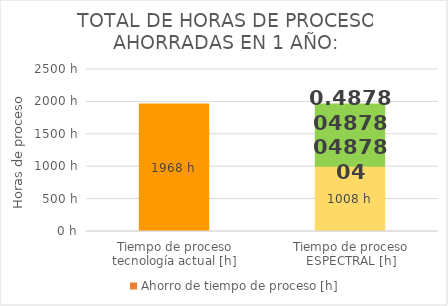
| Category | Tiempo de proceso tecnología actual [h] | Ahorro de tiempo de proceso [h] |
|---|---|---|
| Tiempo de proceso tecnología actual [h] | 1968 | 0 |
| Tiempo de proceso ESPECTRAL [h] | 1008 | 960 |